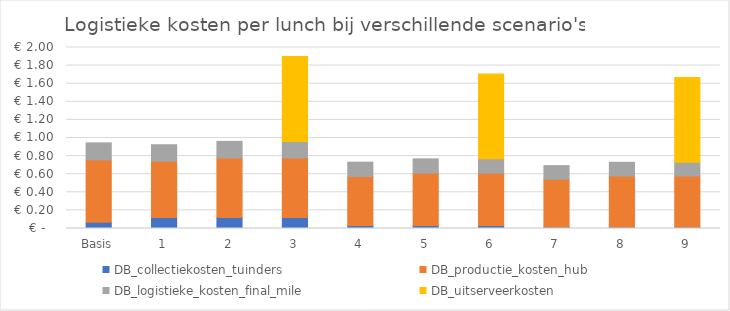
| Category | DB_collectiekosten_tuinders | DB_productie_kosten_hub | DB_logistieke_kosten_final_mile | DB_uitserveerkosten |
|---|---|---|---|---|
| Basis | 0.069 | 0.689 | 0.188 | 0 |
| 1 | 0.122 | 0.622 | 0.182 | 0 |
| 2 | 0.122 | 0.659 | 0.182 | 0 |
| 3 | 0.122 | 0.659 | 0.182 | 0.938 |
| 4 | 0.032 | 0.542 | 0.158 | 0 |
| 5 | 0.032 | 0.579 | 0.158 | 0 |
| 6 | 0.032 | 0.579 | 0.158 | 0.938 |
| 7 | 0.016 | 0.528 | 0.151 | 0 |
| 8 | 0.016 | 0.564 | 0.151 | 0 |
| 9 | 0.016 | 0.564 | 0.151 | 0.938 |